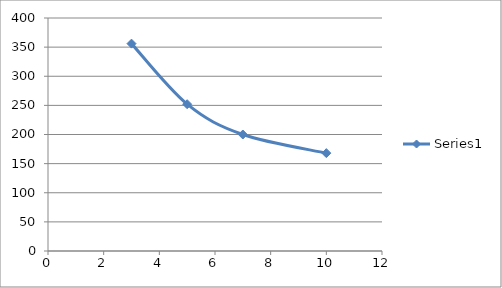
| Category | Series 0 |
|---|---|
| 3.0 | 356 |
| 5.0 | 252 |
| 7.0 | 200 |
| 10.0 | 168 |